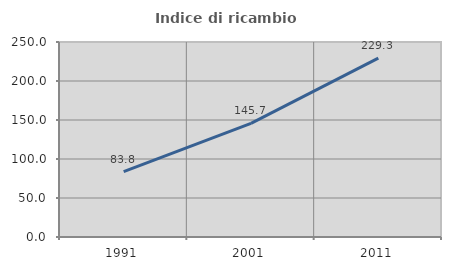
| Category | Indice di ricambio occupazionale  |
|---|---|
| 1991.0 | 83.76 |
| 2001.0 | 145.664 |
| 2011.0 | 229.307 |